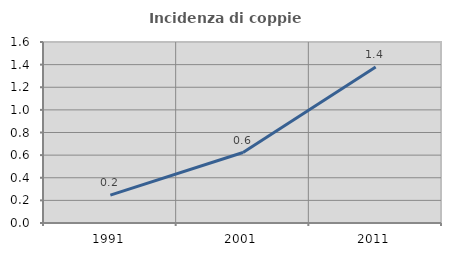
| Category | Incidenza di coppie miste |
|---|---|
| 1991.0 | 0.246 |
| 2001.0 | 0.623 |
| 2011.0 | 1.38 |